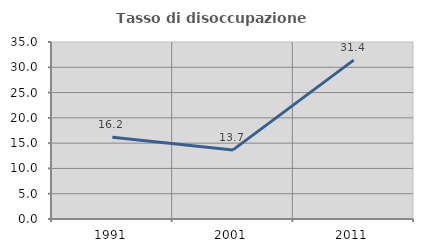
| Category | Tasso di disoccupazione giovanile  |
|---|---|
| 1991.0 | 16.159 |
| 2001.0 | 13.66 |
| 2011.0 | 31.41 |